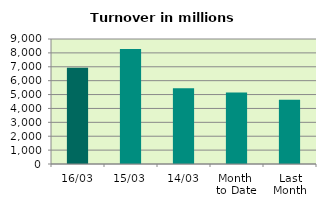
| Category | Series 0 |
|---|---|
| 16/03 | 6937.051 |
| 15/03 | 8286.236 |
| 14/03 | 5446.001 |
| Month 
to Date | 5145.038 |
| Last
Month | 4623.097 |